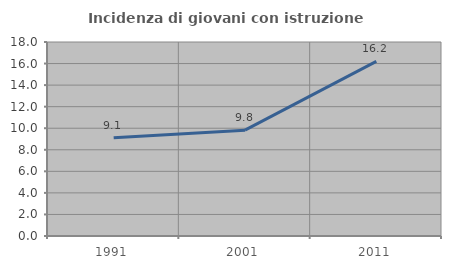
| Category | Incidenza di giovani con istruzione universitaria |
|---|---|
| 1991.0 | 9.107 |
| 2001.0 | 9.822 |
| 2011.0 | 16.203 |